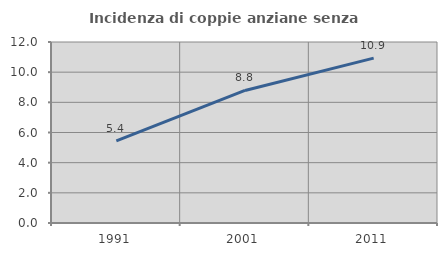
| Category | Incidenza di coppie anziane senza figli  |
|---|---|
| 1991.0 | 5.447 |
| 2001.0 | 8.787 |
| 2011.0 | 10.929 |